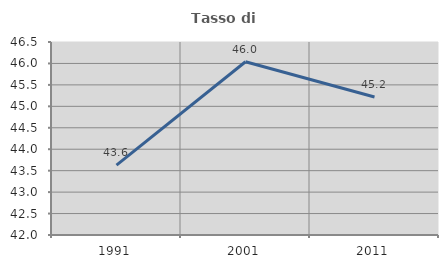
| Category | Tasso di occupazione   |
|---|---|
| 1991.0 | 43.63 |
| 2001.0 | 46.04 |
| 2011.0 | 45.217 |